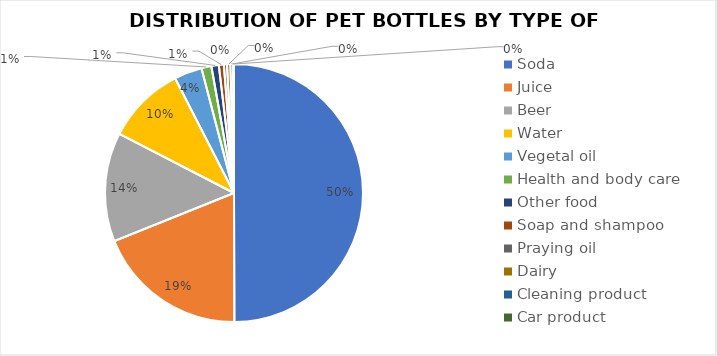
| Category | Series 0 |
|---|---|
| Soda | 3334 |
| Juice | 1265 |
| Beer | 913 |
| Water | 658 |
| Vegetal oil | 233 |
| Health and body care | 83 |
| Other food | 62 |
| Soap and shampoo | 42 |
| Praying oil | 26 |
| Dairy | 28 |
| Cleaning product | 22 |
| Car product | 8 |